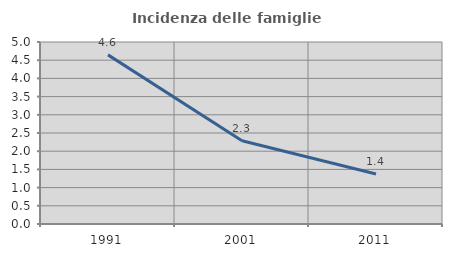
| Category | Incidenza delle famiglie numerose |
|---|---|
| 1991.0 | 4.647 |
| 2001.0 | 2.286 |
| 2011.0 | 1.375 |